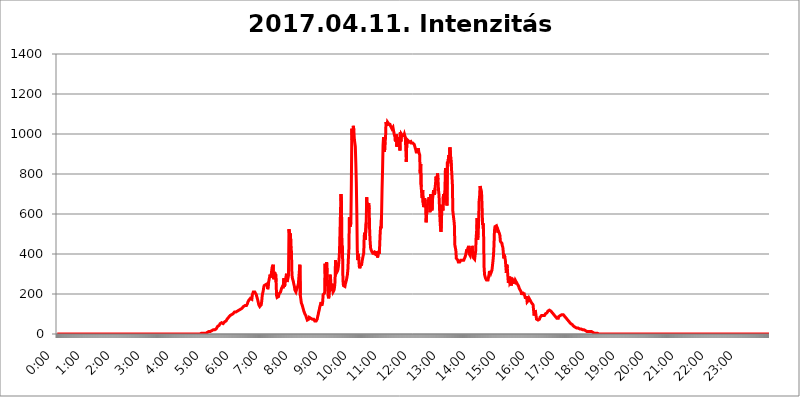
| Category | 2017.04.11. Intenzitás [W/m^2] |
|---|---|
| 0.0 | 0 |
| 0.0006944444444444445 | 0 |
| 0.001388888888888889 | 0 |
| 0.0020833333333333333 | 0 |
| 0.002777777777777778 | 0 |
| 0.003472222222222222 | 0 |
| 0.004166666666666667 | 0 |
| 0.004861111111111111 | 0 |
| 0.005555555555555556 | 0 |
| 0.0062499999999999995 | 0 |
| 0.006944444444444444 | 0 |
| 0.007638888888888889 | 0 |
| 0.008333333333333333 | 0 |
| 0.009027777777777779 | 0 |
| 0.009722222222222222 | 0 |
| 0.010416666666666666 | 0 |
| 0.011111111111111112 | 0 |
| 0.011805555555555555 | 0 |
| 0.012499999999999999 | 0 |
| 0.013194444444444444 | 0 |
| 0.013888888888888888 | 0 |
| 0.014583333333333332 | 0 |
| 0.015277777777777777 | 0 |
| 0.015972222222222224 | 0 |
| 0.016666666666666666 | 0 |
| 0.017361111111111112 | 0 |
| 0.018055555555555557 | 0 |
| 0.01875 | 0 |
| 0.019444444444444445 | 0 |
| 0.02013888888888889 | 0 |
| 0.020833333333333332 | 0 |
| 0.02152777777777778 | 0 |
| 0.022222222222222223 | 0 |
| 0.02291666666666667 | 0 |
| 0.02361111111111111 | 0 |
| 0.024305555555555556 | 0 |
| 0.024999999999999998 | 0 |
| 0.025694444444444447 | 0 |
| 0.02638888888888889 | 0 |
| 0.027083333333333334 | 0 |
| 0.027777777777777776 | 0 |
| 0.02847222222222222 | 0 |
| 0.029166666666666664 | 0 |
| 0.029861111111111113 | 0 |
| 0.030555555555555555 | 0 |
| 0.03125 | 0 |
| 0.03194444444444445 | 0 |
| 0.03263888888888889 | 0 |
| 0.03333333333333333 | 0 |
| 0.034027777777777775 | 0 |
| 0.034722222222222224 | 0 |
| 0.035416666666666666 | 0 |
| 0.036111111111111115 | 0 |
| 0.03680555555555556 | 0 |
| 0.0375 | 0 |
| 0.03819444444444444 | 0 |
| 0.03888888888888889 | 0 |
| 0.03958333333333333 | 0 |
| 0.04027777777777778 | 0 |
| 0.04097222222222222 | 0 |
| 0.041666666666666664 | 0 |
| 0.042361111111111106 | 0 |
| 0.04305555555555556 | 0 |
| 0.043750000000000004 | 0 |
| 0.044444444444444446 | 0 |
| 0.04513888888888889 | 0 |
| 0.04583333333333334 | 0 |
| 0.04652777777777778 | 0 |
| 0.04722222222222222 | 0 |
| 0.04791666666666666 | 0 |
| 0.04861111111111111 | 0 |
| 0.049305555555555554 | 0 |
| 0.049999999999999996 | 0 |
| 0.05069444444444445 | 0 |
| 0.051388888888888894 | 0 |
| 0.052083333333333336 | 0 |
| 0.05277777777777778 | 0 |
| 0.05347222222222222 | 0 |
| 0.05416666666666667 | 0 |
| 0.05486111111111111 | 0 |
| 0.05555555555555555 | 0 |
| 0.05625 | 0 |
| 0.05694444444444444 | 0 |
| 0.057638888888888885 | 0 |
| 0.05833333333333333 | 0 |
| 0.05902777777777778 | 0 |
| 0.059722222222222225 | 0 |
| 0.06041666666666667 | 0 |
| 0.061111111111111116 | 0 |
| 0.06180555555555556 | 0 |
| 0.0625 | 0 |
| 0.06319444444444444 | 0 |
| 0.06388888888888888 | 0 |
| 0.06458333333333334 | 0 |
| 0.06527777777777778 | 0 |
| 0.06597222222222222 | 0 |
| 0.06666666666666667 | 0 |
| 0.06736111111111111 | 0 |
| 0.06805555555555555 | 0 |
| 0.06874999999999999 | 0 |
| 0.06944444444444443 | 0 |
| 0.07013888888888889 | 0 |
| 0.07083333333333333 | 0 |
| 0.07152777777777779 | 0 |
| 0.07222222222222223 | 0 |
| 0.07291666666666667 | 0 |
| 0.07361111111111111 | 0 |
| 0.07430555555555556 | 0 |
| 0.075 | 0 |
| 0.07569444444444444 | 0 |
| 0.0763888888888889 | 0 |
| 0.07708333333333334 | 0 |
| 0.07777777777777778 | 0 |
| 0.07847222222222222 | 0 |
| 0.07916666666666666 | 0 |
| 0.0798611111111111 | 0 |
| 0.08055555555555556 | 0 |
| 0.08125 | 0 |
| 0.08194444444444444 | 0 |
| 0.08263888888888889 | 0 |
| 0.08333333333333333 | 0 |
| 0.08402777777777777 | 0 |
| 0.08472222222222221 | 0 |
| 0.08541666666666665 | 0 |
| 0.08611111111111112 | 0 |
| 0.08680555555555557 | 0 |
| 0.08750000000000001 | 0 |
| 0.08819444444444445 | 0 |
| 0.08888888888888889 | 0 |
| 0.08958333333333333 | 0 |
| 0.09027777777777778 | 0 |
| 0.09097222222222222 | 0 |
| 0.09166666666666667 | 0 |
| 0.09236111111111112 | 0 |
| 0.09305555555555556 | 0 |
| 0.09375 | 0 |
| 0.09444444444444444 | 0 |
| 0.09513888888888888 | 0 |
| 0.09583333333333333 | 0 |
| 0.09652777777777777 | 0 |
| 0.09722222222222222 | 0 |
| 0.09791666666666667 | 0 |
| 0.09861111111111111 | 0 |
| 0.09930555555555555 | 0 |
| 0.09999999999999999 | 0 |
| 0.10069444444444443 | 0 |
| 0.1013888888888889 | 0 |
| 0.10208333333333335 | 0 |
| 0.10277777777777779 | 0 |
| 0.10347222222222223 | 0 |
| 0.10416666666666667 | 0 |
| 0.10486111111111111 | 0 |
| 0.10555555555555556 | 0 |
| 0.10625 | 0 |
| 0.10694444444444444 | 0 |
| 0.1076388888888889 | 0 |
| 0.10833333333333334 | 0 |
| 0.10902777777777778 | 0 |
| 0.10972222222222222 | 0 |
| 0.1111111111111111 | 0 |
| 0.11180555555555556 | 0 |
| 0.11180555555555556 | 0 |
| 0.1125 | 0 |
| 0.11319444444444444 | 0 |
| 0.11388888888888889 | 0 |
| 0.11458333333333333 | 0 |
| 0.11527777777777777 | 0 |
| 0.11597222222222221 | 0 |
| 0.11666666666666665 | 0 |
| 0.1173611111111111 | 0 |
| 0.11805555555555557 | 0 |
| 0.11944444444444445 | 0 |
| 0.12013888888888889 | 0 |
| 0.12083333333333333 | 0 |
| 0.12152777777777778 | 0 |
| 0.12222222222222223 | 0 |
| 0.12291666666666667 | 0 |
| 0.12291666666666667 | 0 |
| 0.12361111111111112 | 0 |
| 0.12430555555555556 | 0 |
| 0.125 | 0 |
| 0.12569444444444444 | 0 |
| 0.12638888888888888 | 0 |
| 0.12708333333333333 | 0 |
| 0.16875 | 0 |
| 0.12847222222222224 | 0 |
| 0.12916666666666668 | 0 |
| 0.12986111111111112 | 0 |
| 0.13055555555555556 | 0 |
| 0.13125 | 0 |
| 0.13194444444444445 | 0 |
| 0.1326388888888889 | 0 |
| 0.13333333333333333 | 0 |
| 0.13402777777777777 | 0 |
| 0.13402777777777777 | 0 |
| 0.13472222222222222 | 0 |
| 0.13541666666666666 | 0 |
| 0.1361111111111111 | 0 |
| 0.13749999999999998 | 0 |
| 0.13819444444444443 | 0 |
| 0.1388888888888889 | 0 |
| 0.13958333333333334 | 0 |
| 0.14027777777777778 | 0 |
| 0.14097222222222222 | 0 |
| 0.14166666666666666 | 0 |
| 0.1423611111111111 | 0 |
| 0.14305555555555557 | 0 |
| 0.14375000000000002 | 0 |
| 0.14444444444444446 | 0 |
| 0.1451388888888889 | 0 |
| 0.1451388888888889 | 0 |
| 0.14652777777777778 | 0 |
| 0.14722222222222223 | 0 |
| 0.14791666666666667 | 0 |
| 0.1486111111111111 | 0 |
| 0.14930555555555555 | 0 |
| 0.15 | 0 |
| 0.15069444444444444 | 0 |
| 0.15138888888888888 | 0 |
| 0.15208333333333332 | 0 |
| 0.15277777777777776 | 0 |
| 0.15347222222222223 | 0 |
| 0.15416666666666667 | 0 |
| 0.15486111111111112 | 0 |
| 0.15555555555555556 | 0 |
| 0.15625 | 0 |
| 0.15694444444444444 | 0 |
| 0.15763888888888888 | 0 |
| 0.15833333333333333 | 0 |
| 0.15902777777777777 | 0 |
| 0.15972222222222224 | 0 |
| 0.16041666666666668 | 0 |
| 0.16111111111111112 | 0 |
| 0.16180555555555556 | 0 |
| 0.1625 | 0 |
| 0.16319444444444445 | 0 |
| 0.1638888888888889 | 0 |
| 0.16458333333333333 | 0 |
| 0.16527777777777777 | 0 |
| 0.16597222222222222 | 0 |
| 0.16666666666666666 | 0 |
| 0.1673611111111111 | 0 |
| 0.16805555555555554 | 0 |
| 0.16874999999999998 | 0 |
| 0.16944444444444443 | 0 |
| 0.17013888888888887 | 0 |
| 0.1708333333333333 | 0 |
| 0.17152777777777775 | 0 |
| 0.17222222222222225 | 0 |
| 0.1729166666666667 | 0 |
| 0.17361111111111113 | 0 |
| 0.17430555555555557 | 0 |
| 0.17500000000000002 | 0 |
| 0.17569444444444446 | 0 |
| 0.1763888888888889 | 0 |
| 0.17708333333333334 | 0 |
| 0.17777777777777778 | 0 |
| 0.17847222222222223 | 0 |
| 0.17916666666666667 | 0 |
| 0.1798611111111111 | 0 |
| 0.18055555555555555 | 0 |
| 0.18125 | 0 |
| 0.18194444444444444 | 0 |
| 0.1826388888888889 | 0 |
| 0.18333333333333335 | 0 |
| 0.1840277777777778 | 0 |
| 0.18472222222222223 | 0 |
| 0.18541666666666667 | 0 |
| 0.18611111111111112 | 0 |
| 0.18680555555555556 | 0 |
| 0.1875 | 0 |
| 0.18819444444444444 | 0 |
| 0.18888888888888888 | 0 |
| 0.18958333333333333 | 0 |
| 0.19027777777777777 | 0 |
| 0.1909722222222222 | 0 |
| 0.19166666666666665 | 0 |
| 0.19236111111111112 | 0 |
| 0.19305555555555554 | 0 |
| 0.19375 | 0 |
| 0.19444444444444445 | 0 |
| 0.1951388888888889 | 0 |
| 0.19583333333333333 | 0 |
| 0.19652777777777777 | 0 |
| 0.19722222222222222 | 0 |
| 0.19791666666666666 | 0 |
| 0.1986111111111111 | 0 |
| 0.19930555555555554 | 0 |
| 0.19999999999999998 | 0 |
| 0.20069444444444443 | 0 |
| 0.20138888888888887 | 0 |
| 0.2020833333333333 | 3.525 |
| 0.2027777777777778 | 0 |
| 0.2034722222222222 | 3.525 |
| 0.2041666666666667 | 3.525 |
| 0.20486111111111113 | 3.525 |
| 0.20555555555555557 | 3.525 |
| 0.20625000000000002 | 3.525 |
| 0.20694444444444446 | 3.525 |
| 0.2076388888888889 | 3.525 |
| 0.20833333333333334 | 3.525 |
| 0.20902777777777778 | 3.525 |
| 0.20972222222222223 | 7.887 |
| 0.21041666666666667 | 7.887 |
| 0.2111111111111111 | 7.887 |
| 0.21180555555555555 | 7.887 |
| 0.2125 | 12.257 |
| 0.21319444444444444 | 12.257 |
| 0.2138888888888889 | 12.257 |
| 0.21458333333333335 | 12.257 |
| 0.2152777777777778 | 12.257 |
| 0.21597222222222223 | 12.257 |
| 0.21666666666666667 | 16.636 |
| 0.21736111111111112 | 16.636 |
| 0.21805555555555556 | 16.636 |
| 0.21875 | 21.024 |
| 0.21944444444444444 | 21.024 |
| 0.22013888888888888 | 21.024 |
| 0.22083333333333333 | 21.024 |
| 0.22152777777777777 | 25.419 |
| 0.2222222222222222 | 25.419 |
| 0.22291666666666665 | 25.419 |
| 0.2236111111111111 | 29.823 |
| 0.22430555555555556 | 29.823 |
| 0.225 | 38.653 |
| 0.22569444444444445 | 43.079 |
| 0.2263888888888889 | 43.079 |
| 0.22708333333333333 | 43.079 |
| 0.22777777777777777 | 47.511 |
| 0.22847222222222222 | 51.951 |
| 0.22916666666666666 | 51.951 |
| 0.2298611111111111 | 56.398 |
| 0.23055555555555554 | 56.398 |
| 0.23124999999999998 | 60.85 |
| 0.23194444444444443 | 56.398 |
| 0.23263888888888887 | 51.951 |
| 0.2333333333333333 | 56.398 |
| 0.2340277777777778 | 56.398 |
| 0.2347222222222222 | 60.85 |
| 0.2354166666666667 | 60.85 |
| 0.23611111111111113 | 60.85 |
| 0.23680555555555557 | 65.31 |
| 0.23750000000000002 | 69.775 |
| 0.23819444444444446 | 74.246 |
| 0.2388888888888889 | 78.722 |
| 0.23958333333333334 | 78.722 |
| 0.24027777777777778 | 83.205 |
| 0.24097222222222223 | 87.692 |
| 0.24166666666666667 | 87.692 |
| 0.2423611111111111 | 92.184 |
| 0.24305555555555555 | 92.184 |
| 0.24375 | 96.682 |
| 0.24444444444444446 | 96.682 |
| 0.24513888888888888 | 101.184 |
| 0.24583333333333335 | 101.184 |
| 0.2465277777777778 | 101.184 |
| 0.24722222222222223 | 101.184 |
| 0.24791666666666667 | 105.69 |
| 0.24861111111111112 | 110.201 |
| 0.24930555555555556 | 110.201 |
| 0.25 | 114.716 |
| 0.25069444444444444 | 110.201 |
| 0.2513888888888889 | 114.716 |
| 0.2520833333333333 | 114.716 |
| 0.25277777777777777 | 114.716 |
| 0.2534722222222222 | 114.716 |
| 0.25416666666666665 | 119.235 |
| 0.2548611111111111 | 119.235 |
| 0.2555555555555556 | 123.758 |
| 0.25625000000000003 | 123.758 |
| 0.2569444444444445 | 123.758 |
| 0.2576388888888889 | 128.284 |
| 0.25833333333333336 | 128.284 |
| 0.2590277777777778 | 128.284 |
| 0.25972222222222224 | 132.814 |
| 0.2604166666666667 | 132.814 |
| 0.2611111111111111 | 137.347 |
| 0.26180555555555557 | 137.347 |
| 0.2625 | 137.347 |
| 0.26319444444444445 | 141.884 |
| 0.2638888888888889 | 146.423 |
| 0.26458333333333334 | 146.423 |
| 0.2652777777777778 | 141.884 |
| 0.2659722222222222 | 146.423 |
| 0.26666666666666666 | 150.964 |
| 0.2673611111111111 | 160.056 |
| 0.26805555555555555 | 164.605 |
| 0.26875 | 169.156 |
| 0.26944444444444443 | 169.156 |
| 0.2701388888888889 | 173.709 |
| 0.2708333333333333 | 178.264 |
| 0.27152777777777776 | 182.82 |
| 0.2722222222222222 | 182.82 |
| 0.27291666666666664 | 173.709 |
| 0.2736111111111111 | 196.497 |
| 0.2743055555555555 | 201.058 |
| 0.27499999999999997 | 210.182 |
| 0.27569444444444446 | 210.182 |
| 0.27638888888888885 | 210.182 |
| 0.27708333333333335 | 210.182 |
| 0.2777777777777778 | 205.62 |
| 0.27847222222222223 | 205.62 |
| 0.2791666666666667 | 196.497 |
| 0.2798611111111111 | 191.937 |
| 0.28055555555555556 | 191.937 |
| 0.28125 | 169.156 |
| 0.28194444444444444 | 164.605 |
| 0.2826388888888889 | 146.423 |
| 0.2833333333333333 | 141.884 |
| 0.28402777777777777 | 137.347 |
| 0.2847222222222222 | 137.347 |
| 0.28541666666666665 | 141.884 |
| 0.28611111111111115 | 146.423 |
| 0.28680555555555554 | 164.605 |
| 0.28750000000000003 | 191.937 |
| 0.2881944444444445 | 205.62 |
| 0.2888888888888889 | 214.746 |
| 0.28958333333333336 | 233 |
| 0.2902777777777778 | 242.127 |
| 0.29097222222222224 | 246.689 |
| 0.2916666666666667 | 246.689 |
| 0.2923611111111111 | 246.689 |
| 0.29305555555555557 | 251.251 |
| 0.29375 | 246.689 |
| 0.29444444444444445 | 251.251 |
| 0.2951388888888889 | 223.873 |
| 0.29583333333333334 | 223.873 |
| 0.2965277777777778 | 260.373 |
| 0.2972222222222222 | 274.047 |
| 0.29791666666666666 | 269.49 |
| 0.2986111111111111 | 296.808 |
| 0.29930555555555555 | 283.156 |
| 0.3 | 292.259 |
| 0.30069444444444443 | 314.98 |
| 0.3013888888888889 | 333.113 |
| 0.3020833333333333 | 337.639 |
| 0.30277777777777776 | 346.682 |
| 0.3034722222222222 | 274.047 |
| 0.30416666666666664 | 269.49 |
| 0.3048611111111111 | 310.44 |
| 0.3055555555555555 | 292.259 |
| 0.30624999999999997 | 301.354 |
| 0.3069444444444444 | 260.373 |
| 0.3076388888888889 | 191.937 |
| 0.30833333333333335 | 182.82 |
| 0.3090277777777778 | 182.82 |
| 0.30972222222222223 | 182.82 |
| 0.3104166666666667 | 187.378 |
| 0.3111111111111111 | 201.058 |
| 0.31180555555555556 | 201.058 |
| 0.3125 | 201.058 |
| 0.31319444444444444 | 210.182 |
| 0.3138888888888889 | 219.309 |
| 0.3145833333333333 | 228.436 |
| 0.31527777777777777 | 228.436 |
| 0.3159722222222222 | 237.564 |
| 0.31666666666666665 | 228.436 |
| 0.31736111111111115 | 233 |
| 0.31805555555555554 | 278.603 |
| 0.31875000000000003 | 237.564 |
| 0.3194444444444445 | 251.251 |
| 0.3201388888888889 | 269.49 |
| 0.32083333333333336 | 269.49 |
| 0.3215277777777778 | 301.354 |
| 0.32222222222222224 | 260.373 |
| 0.3229166666666667 | 269.49 |
| 0.3236111111111111 | 278.603 |
| 0.32430555555555557 | 292.259 |
| 0.325 | 523.88 |
| 0.32569444444444445 | 502.192 |
| 0.3263888888888889 | 475.972 |
| 0.32708333333333334 | 502.192 |
| 0.3277777777777778 | 427.39 |
| 0.3284722222222222 | 414.035 |
| 0.32916666666666666 | 296.808 |
| 0.3298611111111111 | 278.603 |
| 0.33055555555555555 | 269.49 |
| 0.33125 | 260.373 |
| 0.33194444444444443 | 246.689 |
| 0.3326388888888889 | 237.564 |
| 0.3333333333333333 | 219.309 |
| 0.3340277777777778 | 214.746 |
| 0.3347222222222222 | 210.182 |
| 0.3354166666666667 | 219.309 |
| 0.3361111111111111 | 223.873 |
| 0.3368055555555556 | 233 |
| 0.33749999999999997 | 242.127 |
| 0.33819444444444446 | 251.251 |
| 0.33888888888888885 | 251.251 |
| 0.33958333333333335 | 246.689 |
| 0.34027777777777773 | 346.682 |
| 0.34097222222222223 | 191.937 |
| 0.3416666666666666 | 173.709 |
| 0.3423611111111111 | 155.509 |
| 0.3430555555555555 | 150.964 |
| 0.34375 | 141.884 |
| 0.3444444444444445 | 137.347 |
| 0.3451388888888889 | 123.758 |
| 0.3458333333333334 | 114.716 |
| 0.34652777777777777 | 110.201 |
| 0.34722222222222227 | 101.184 |
| 0.34791666666666665 | 96.682 |
| 0.34861111111111115 | 92.184 |
| 0.34930555555555554 | 83.205 |
| 0.35000000000000003 | 78.722 |
| 0.3506944444444444 | 69.775 |
| 0.3513888888888889 | 69.775 |
| 0.3520833333333333 | 69.775 |
| 0.3527777777777778 | 74.246 |
| 0.3534722222222222 | 83.205 |
| 0.3541666666666667 | 83.205 |
| 0.3548611111111111 | 83.205 |
| 0.35555555555555557 | 78.722 |
| 0.35625 | 78.722 |
| 0.35694444444444445 | 78.722 |
| 0.3576388888888889 | 74.246 |
| 0.35833333333333334 | 74.246 |
| 0.3590277777777778 | 74.246 |
| 0.3597222222222222 | 74.246 |
| 0.36041666666666666 | 69.775 |
| 0.3611111111111111 | 65.31 |
| 0.36180555555555555 | 65.31 |
| 0.3625 | 60.85 |
| 0.36319444444444443 | 65.31 |
| 0.3638888888888889 | 69.775 |
| 0.3645833333333333 | 74.246 |
| 0.3652777777777778 | 87.692 |
| 0.3659722222222222 | 96.682 |
| 0.3666666666666667 | 110.201 |
| 0.3673611111111111 | 119.235 |
| 0.3680555555555556 | 132.814 |
| 0.36874999999999997 | 141.884 |
| 0.36944444444444446 | 146.423 |
| 0.37013888888888885 | 160.056 |
| 0.37083333333333335 | 141.884 |
| 0.37152777777777773 | 146.423 |
| 0.37222222222222223 | 160.056 |
| 0.3729166666666666 | 196.497 |
| 0.3736111111111111 | 191.937 |
| 0.3743055555555555 | 191.937 |
| 0.375 | 205.62 |
| 0.3756944444444445 | 351.198 |
| 0.3763888888888889 | 255.813 |
| 0.3770833333333334 | 274.047 |
| 0.37777777777777777 | 360.221 |
| 0.37847222222222227 | 305.898 |
| 0.37916666666666665 | 242.127 |
| 0.37986111111111115 | 191.937 |
| 0.38055555555555554 | 178.264 |
| 0.38125000000000003 | 191.937 |
| 0.3819444444444444 | 219.309 |
| 0.3826388888888889 | 296.808 |
| 0.3833333333333333 | 278.603 |
| 0.3840277777777778 | 237.564 |
| 0.3847222222222222 | 214.746 |
| 0.3854166666666667 | 251.251 |
| 0.3861111111111111 | 223.873 |
| 0.38680555555555557 | 210.182 |
| 0.3875 | 214.746 |
| 0.38819444444444445 | 219.309 |
| 0.3888888888888889 | 233 |
| 0.38958333333333334 | 260.373 |
| 0.3902777777777778 | 369.23 |
| 0.3909722222222222 | 314.98 |
| 0.39166666666666666 | 305.898 |
| 0.3923611111111111 | 301.354 |
| 0.39305555555555555 | 314.98 |
| 0.39375 | 324.052 |
| 0.39444444444444443 | 342.162 |
| 0.3951388888888889 | 369.23 |
| 0.3958333333333333 | 409.574 |
| 0.3965277777777778 | 409.574 |
| 0.3972222222222222 | 414.035 |
| 0.3979166666666667 | 699.717 |
| 0.3986111111111111 | 658.909 |
| 0.3993055555555556 | 449.551 |
| 0.39999999999999997 | 436.27 |
| 0.40069444444444446 | 269.49 |
| 0.40138888888888885 | 242.127 |
| 0.40208333333333335 | 242.127 |
| 0.40277777777777773 | 237.564 |
| 0.40347222222222223 | 237.564 |
| 0.4041666666666666 | 251.251 |
| 0.4048611111111111 | 260.373 |
| 0.4055555555555555 | 269.49 |
| 0.40625 | 283.156 |
| 0.4069444444444445 | 296.808 |
| 0.4076388888888889 | 324.052 |
| 0.4083333333333334 | 378.224 |
| 0.40902777777777777 | 422.943 |
| 0.40972222222222227 | 583.779 |
| 0.41041666666666665 | 545.416 |
| 0.41111111111111115 | 536.82 |
| 0.41180555555555554 | 558.261 |
| 0.41250000000000003 | 751.803 |
| 0.4131944444444444 | 1026.06 |
| 0.4138888888888889 | 970.034 |
| 0.4145833333333333 | 1007.383 |
| 0.4152777777777778 | 1041.019 |
| 0.4159722222222222 | 1018.587 |
| 0.4166666666666667 | 973.772 |
| 0.4173611111111111 | 970.034 |
| 0.41805555555555557 | 936.33 |
| 0.41875 | 856.855 |
| 0.41944444444444445 | 759.723 |
| 0.4201388888888889 | 613.252 |
| 0.42083333333333334 | 414.035 |
| 0.4215277777777778 | 369.23 |
| 0.4222222222222222 | 400.638 |
| 0.42291666666666666 | 378.224 |
| 0.4236111111111111 | 337.639 |
| 0.42430555555555555 | 328.584 |
| 0.425 | 333.113 |
| 0.42569444444444443 | 355.712 |
| 0.4263888888888889 | 342.162 |
| 0.4270833333333333 | 351.198 |
| 0.4277777777777778 | 369.23 |
| 0.4284722222222222 | 369.23 |
| 0.4291666666666667 | 364.728 |
| 0.4298611111111111 | 405.108 |
| 0.4305555555555556 | 489.108 |
| 0.43124999999999997 | 506.542 |
| 0.43194444444444446 | 471.582 |
| 0.43263888888888885 | 467.187 |
| 0.43333333333333335 | 558.261 |
| 0.43402777777777773 | 683.473 |
| 0.43472222222222223 | 613.252 |
| 0.4354166666666666 | 621.613 |
| 0.4361111111111111 | 621.613 |
| 0.4368055555555555 | 654.791 |
| 0.4375 | 625.784 |
| 0.4381944444444445 | 510.885 |
| 0.4388888888888889 | 458.38 |
| 0.4395833333333334 | 427.39 |
| 0.44027777777777777 | 422.943 |
| 0.44097222222222227 | 414.035 |
| 0.44166666666666665 | 409.574 |
| 0.44236111111111115 | 405.108 |
| 0.44305555555555554 | 409.574 |
| 0.44375000000000003 | 405.108 |
| 0.4444444444444444 | 409.574 |
| 0.4451388888888889 | 400.638 |
| 0.4458333333333333 | 396.164 |
| 0.4465277777777778 | 396.164 |
| 0.4472222222222222 | 396.164 |
| 0.4479166666666667 | 405.108 |
| 0.4486111111111111 | 414.035 |
| 0.44930555555555557 | 382.715 |
| 0.45 | 400.638 |
| 0.45069444444444445 | 414.035 |
| 0.4513888888888889 | 400.638 |
| 0.45208333333333334 | 431.833 |
| 0.4527777777777778 | 493.475 |
| 0.4534722222222222 | 536.82 |
| 0.45416666666666666 | 528.2 |
| 0.4548611111111111 | 596.45 |
| 0.45555555555555555 | 723.889 |
| 0.45625 | 818.392 |
| 0.45694444444444443 | 943.832 |
| 0.4576388888888889 | 984.98 |
| 0.4583333333333333 | 921.298 |
| 0.4590277777777778 | 909.996 |
| 0.4597222222222222 | 962.555 |
| 0.4604166666666667 | 977.508 |
| 0.4611111111111111 | 1059.756 |
| 0.4618055555555556 | 1059.756 |
| 0.46249999999999997 | 1041.019 |
| 0.46319444444444446 | 1059.756 |
| 0.46388888888888885 | 1056.004 |
| 0.46458333333333335 | 1052.255 |
| 0.46527777777777773 | 1052.255 |
| 0.46597222222222223 | 1052.255 |
| 0.4666666666666666 | 1048.508 |
| 0.4673611111111111 | 1041.019 |
| 0.4680555555555555 | 1044.762 |
| 0.46875 | 1037.277 |
| 0.4694444444444445 | 1026.06 |
| 0.4701388888888889 | 1022.323 |
| 0.4708333333333334 | 1033.537 |
| 0.47152777777777777 | 1037.277 |
| 0.47222222222222227 | 1033.537 |
| 0.47291666666666665 | 992.448 |
| 0.47361111111111115 | 999.916 |
| 0.47430555555555554 | 962.555 |
| 0.47500000000000003 | 970.034 |
| 0.4756944444444444 | 999.916 |
| 0.4763888888888889 | 936.33 |
| 0.4770833333333333 | 966.295 |
| 0.4777777777777778 | 970.034 |
| 0.4784722222222222 | 984.98 |
| 0.4791666666666667 | 988.714 |
| 0.4798611111111111 | 966.295 |
| 0.48055555555555557 | 917.534 |
| 0.48125 | 1007.383 |
| 0.48194444444444445 | 962.555 |
| 0.4826388888888889 | 999.916 |
| 0.48333333333333334 | 999.916 |
| 0.4840277777777778 | 992.448 |
| 0.4847222222222222 | 992.448 |
| 0.48541666666666666 | 988.714 |
| 0.4861111111111111 | 992.448 |
| 0.48680555555555555 | 999.916 |
| 0.4875 | 996.182 |
| 0.48819444444444443 | 981.244 |
| 0.4888888888888889 | 984.98 |
| 0.4895833333333333 | 860.676 |
| 0.4902777777777778 | 973.772 |
| 0.4909722222222222 | 977.508 |
| 0.4916666666666667 | 970.034 |
| 0.4923611111111111 | 966.295 |
| 0.4930555555555556 | 966.295 |
| 0.49374999999999997 | 958.814 |
| 0.49444444444444446 | 962.555 |
| 0.49513888888888885 | 962.555 |
| 0.49583333333333335 | 962.555 |
| 0.49652777777777773 | 955.071 |
| 0.49722222222222223 | 958.814 |
| 0.4979166666666666 | 955.071 |
| 0.4986111111111111 | 955.071 |
| 0.4993055555555555 | 955.071 |
| 0.5 | 955.071 |
| 0.5006944444444444 | 947.58 |
| 0.5013888888888889 | 947.58 |
| 0.5020833333333333 | 943.832 |
| 0.5027777777777778 | 921.298 |
| 0.5034722222222222 | 909.996 |
| 0.5041666666666667 | 913.766 |
| 0.5048611111111111 | 909.996 |
| 0.5055555555555555 | 909.996 |
| 0.50625 | 928.819 |
| 0.5069444444444444 | 913.766 |
| 0.5076388888888889 | 902.447 |
| 0.5083333333333333 | 894.885 |
| 0.5090277777777777 | 802.868 |
| 0.5097222222222222 | 849.199 |
| 0.5104166666666666 | 735.89 |
| 0.5111111111111112 | 703.762 |
| 0.5118055555555555 | 679.395 |
| 0.5125000000000001 | 719.877 |
| 0.5131944444444444 | 654.791 |
| 0.513888888888889 | 634.105 |
| 0.5145833333333333 | 646.537 |
| 0.5152777777777778 | 679.395 |
| 0.5159722222222222 | 663.019 |
| 0.5166666666666667 | 634.105 |
| 0.517361111111111 | 558.261 |
| 0.5180555555555556 | 562.53 |
| 0.5187499999999999 | 638.256 |
| 0.5194444444444445 | 650.667 |
| 0.5201388888888888 | 671.22 |
| 0.5208333333333334 | 663.019 |
| 0.5215277777777778 | 683.473 |
| 0.5222222222222223 | 646.537 |
| 0.5229166666666667 | 609.062 |
| 0.5236111111111111 | 699.717 |
| 0.5243055555555556 | 671.22 |
| 0.525 | 625.784 |
| 0.5256944444444445 | 617.436 |
| 0.5263888888888889 | 675.311 |
| 0.5270833333333333 | 695.666 |
| 0.5277777777777778 | 719.877 |
| 0.5284722222222222 | 723.889 |
| 0.5291666666666667 | 695.666 |
| 0.5298611111111111 | 727.896 |
| 0.5305555555555556 | 751.803 |
| 0.53125 | 787.258 |
| 0.5319444444444444 | 763.674 |
| 0.5326388888888889 | 775.492 |
| 0.5333333333333333 | 802.868 |
| 0.5340277777777778 | 771.559 |
| 0.5347222222222222 | 719.877 |
| 0.5354166666666667 | 695.666 |
| 0.5361111111111111 | 634.105 |
| 0.5368055555555555 | 571.049 |
| 0.5375 | 532.513 |
| 0.5381944444444444 | 510.885 |
| 0.5388888888888889 | 566.793 |
| 0.5395833333333333 | 646.537 |
| 0.5402777777777777 | 629.948 |
| 0.5409722222222222 | 617.436 |
| 0.5416666666666666 | 699.717 |
| 0.5423611111111112 | 658.909 |
| 0.5430555555555555 | 695.666 |
| 0.5437500000000001 | 719.877 |
| 0.5444444444444444 | 829.981 |
| 0.545138888888889 | 810.641 |
| 0.5458333333333333 | 715.858 |
| 0.5465277777777778 | 642.4 |
| 0.5472222222222222 | 860.676 |
| 0.5479166666666667 | 853.029 |
| 0.548611111111111 | 875.918 |
| 0.5493055555555556 | 894.885 |
| 0.5499999999999999 | 860.676 |
| 0.5506944444444445 | 932.576 |
| 0.5513888888888888 | 932.576 |
| 0.5520833333333334 | 936.33 |
| 0.5527777777777778 | 837.682 |
| 0.5534722222222223 | 841.526 |
| 0.5541666666666667 | 751.803 |
| 0.5548611111111111 | 613.252 |
| 0.5555555555555556 | 613.252 |
| 0.55625 | 613.252 |
| 0.5569444444444445 | 549.704 |
| 0.5576388888888889 | 445.129 |
| 0.5583333333333333 | 440.702 |
| 0.5590277777777778 | 418.492 |
| 0.5597222222222222 | 378.224 |
| 0.5604166666666667 | 373.729 |
| 0.5611111111111111 | 373.729 |
| 0.5618055555555556 | 369.23 |
| 0.5625 | 360.221 |
| 0.5631944444444444 | 360.221 |
| 0.5638888888888889 | 364.728 |
| 0.5645833333333333 | 360.221 |
| 0.5652777777777778 | 364.728 |
| 0.5659722222222222 | 369.23 |
| 0.5666666666666667 | 364.728 |
| 0.5673611111111111 | 373.729 |
| 0.5680555555555555 | 369.23 |
| 0.56875 | 369.23 |
| 0.5694444444444444 | 369.23 |
| 0.5701388888888889 | 369.23 |
| 0.5708333333333333 | 369.23 |
| 0.5715277777777777 | 373.729 |
| 0.5722222222222222 | 387.202 |
| 0.5729166666666666 | 396.164 |
| 0.5736111111111112 | 409.574 |
| 0.5743055555555555 | 422.943 |
| 0.5750000000000001 | 409.574 |
| 0.5756944444444444 | 414.035 |
| 0.576388888888889 | 431.833 |
| 0.5770833333333333 | 440.702 |
| 0.5777777777777778 | 400.638 |
| 0.5784722222222222 | 405.108 |
| 0.5791666666666667 | 391.685 |
| 0.579861111111111 | 405.108 |
| 0.5805555555555556 | 414.035 |
| 0.5812499999999999 | 422.943 |
| 0.5819444444444445 | 440.702 |
| 0.5826388888888888 | 400.638 |
| 0.5833333333333334 | 382.715 |
| 0.5840277777777778 | 382.715 |
| 0.5847222222222223 | 382.715 |
| 0.5854166666666667 | 373.729 |
| 0.5861111111111111 | 396.164 |
| 0.5868055555555556 | 414.035 |
| 0.5875 | 480.356 |
| 0.5881944444444445 | 515.223 |
| 0.5888888888888889 | 579.542 |
| 0.5895833333333333 | 471.582 |
| 0.5902777777777778 | 493.475 |
| 0.5909722222222222 | 558.261 |
| 0.5916666666666667 | 663.019 |
| 0.5923611111111111 | 687.544 |
| 0.5930555555555556 | 739.877 |
| 0.59375 | 735.89 |
| 0.5944444444444444 | 739.877 |
| 0.5951388888888889 | 703.762 |
| 0.5958333333333333 | 638.256 |
| 0.5965277777777778 | 545.416 |
| 0.5972222222222222 | 553.986 |
| 0.5979166666666667 | 510.885 |
| 0.5986111111111111 | 337.639 |
| 0.5993055555555555 | 296.808 |
| 0.6 | 287.709 |
| 0.6006944444444444 | 278.603 |
| 0.6013888888888889 | 274.047 |
| 0.6020833333333333 | 269.49 |
| 0.6027777777777777 | 269.49 |
| 0.6034722222222222 | 269.49 |
| 0.6041666666666666 | 269.49 |
| 0.6048611111111112 | 283.156 |
| 0.6055555555555555 | 296.808 |
| 0.6062500000000001 | 314.98 |
| 0.6069444444444444 | 301.354 |
| 0.607638888888889 | 314.98 |
| 0.6083333333333333 | 305.898 |
| 0.6090277777777778 | 310.44 |
| 0.6097222222222222 | 319.517 |
| 0.6104166666666667 | 314.98 |
| 0.611111111111111 | 364.728 |
| 0.6118055555555556 | 391.685 |
| 0.6124999999999999 | 440.702 |
| 0.6131944444444445 | 515.223 |
| 0.6138888888888888 | 536.82 |
| 0.6145833333333334 | 536.82 |
| 0.6152777777777778 | 532.513 |
| 0.6159722222222223 | 541.121 |
| 0.6166666666666667 | 532.513 |
| 0.6173611111111111 | 523.88 |
| 0.6180555555555556 | 506.542 |
| 0.61875 | 515.223 |
| 0.6194444444444445 | 510.885 |
| 0.6201388888888889 | 502.192 |
| 0.6208333333333333 | 493.475 |
| 0.6215277777777778 | 462.786 |
| 0.6222222222222222 | 467.187 |
| 0.6229166666666667 | 462.786 |
| 0.6236111111111111 | 453.968 |
| 0.6243055555555556 | 440.702 |
| 0.625 | 431.833 |
| 0.6256944444444444 | 405.108 |
| 0.6263888888888889 | 378.224 |
| 0.6270833333333333 | 396.164 |
| 0.6277777777777778 | 382.715 |
| 0.6284722222222222 | 369.23 |
| 0.6291666666666667 | 373.729 |
| 0.6298611111111111 | 305.898 |
| 0.6305555555555555 | 346.682 |
| 0.63125 | 328.584 |
| 0.6319444444444444 | 333.113 |
| 0.6326388888888889 | 255.813 |
| 0.6333333333333333 | 264.932 |
| 0.6340277777777777 | 287.709 |
| 0.6347222222222222 | 255.813 |
| 0.6354166666666666 | 260.373 |
| 0.6361111111111112 | 264.932 |
| 0.6368055555555555 | 242.127 |
| 0.6375000000000001 | 264.932 |
| 0.6381944444444444 | 274.047 |
| 0.638888888888889 | 251.251 |
| 0.6395833333333333 | 269.49 |
| 0.6402777777777778 | 269.49 |
| 0.6409722222222222 | 269.49 |
| 0.6416666666666667 | 260.373 |
| 0.642361111111111 | 269.49 |
| 0.6430555555555556 | 269.49 |
| 0.6437499999999999 | 264.932 |
| 0.6444444444444445 | 255.813 |
| 0.6451388888888888 | 251.251 |
| 0.6458333333333334 | 246.689 |
| 0.6465277777777778 | 242.127 |
| 0.6472222222222223 | 237.564 |
| 0.6479166666666667 | 228.436 |
| 0.6486111111111111 | 228.436 |
| 0.6493055555555556 | 219.309 |
| 0.65 | 214.746 |
| 0.6506944444444445 | 210.182 |
| 0.6513888888888889 | 196.497 |
| 0.6520833333333333 | 210.182 |
| 0.6527777777777778 | 201.058 |
| 0.6534722222222222 | 201.058 |
| 0.6541666666666667 | 196.497 |
| 0.6548611111111111 | 201.058 |
| 0.6555555555555556 | 196.497 |
| 0.65625 | 182.82 |
| 0.6569444444444444 | 182.82 |
| 0.6576388888888889 | 182.82 |
| 0.6583333333333333 | 182.82 |
| 0.6590277777777778 | 160.056 |
| 0.6597222222222222 | 164.605 |
| 0.6604166666666667 | 164.605 |
| 0.6611111111111111 | 169.156 |
| 0.6618055555555555 | 178.264 |
| 0.6625 | 178.264 |
| 0.6631944444444444 | 178.264 |
| 0.6638888888888889 | 164.605 |
| 0.6645833333333333 | 169.156 |
| 0.6652777777777777 | 155.509 |
| 0.6659722222222222 | 155.509 |
| 0.6666666666666666 | 155.509 |
| 0.6673611111111111 | 146.423 |
| 0.6680555555555556 | 119.235 |
| 0.6687500000000001 | 92.184 |
| 0.6694444444444444 | 101.184 |
| 0.6701388888888888 | 119.235 |
| 0.6708333333333334 | 110.201 |
| 0.6715277777777778 | 92.184 |
| 0.6722222222222222 | 74.246 |
| 0.6729166666666666 | 69.775 |
| 0.6736111111111112 | 69.775 |
| 0.6743055555555556 | 69.775 |
| 0.6749999999999999 | 69.775 |
| 0.6756944444444444 | 74.246 |
| 0.6763888888888889 | 74.246 |
| 0.6770833333333334 | 83.205 |
| 0.6777777777777777 | 83.205 |
| 0.6784722222222223 | 87.692 |
| 0.6791666666666667 | 92.184 |
| 0.6798611111111111 | 92.184 |
| 0.6805555555555555 | 92.184 |
| 0.68125 | 92.184 |
| 0.6819444444444445 | 92.184 |
| 0.6826388888888889 | 92.184 |
| 0.6833333333333332 | 92.184 |
| 0.6840277777777778 | 96.682 |
| 0.6847222222222222 | 101.184 |
| 0.6854166666666667 | 101.184 |
| 0.686111111111111 | 105.69 |
| 0.6868055555555556 | 105.69 |
| 0.6875 | 110.201 |
| 0.6881944444444444 | 114.716 |
| 0.688888888888889 | 114.716 |
| 0.6895833333333333 | 119.235 |
| 0.6902777777777778 | 119.235 |
| 0.6909722222222222 | 119.235 |
| 0.6916666666666668 | 114.716 |
| 0.6923611111111111 | 114.716 |
| 0.6930555555555555 | 110.201 |
| 0.69375 | 110.201 |
| 0.6944444444444445 | 105.69 |
| 0.6951388888888889 | 101.184 |
| 0.6958333333333333 | 101.184 |
| 0.6965277777777777 | 96.682 |
| 0.6972222222222223 | 92.184 |
| 0.6979166666666666 | 92.184 |
| 0.6986111111111111 | 87.692 |
| 0.6993055555555556 | 83.205 |
| 0.7000000000000001 | 83.205 |
| 0.7006944444444444 | 78.722 |
| 0.7013888888888888 | 78.722 |
| 0.7020833333333334 | 78.722 |
| 0.7027777777777778 | 78.722 |
| 0.7034722222222222 | 87.692 |
| 0.7041666666666666 | 83.205 |
| 0.7048611111111112 | 87.692 |
| 0.7055555555555556 | 92.184 |
| 0.7062499999999999 | 96.682 |
| 0.7069444444444444 | 96.682 |
| 0.7076388888888889 | 96.682 |
| 0.7083333333333334 | 96.682 |
| 0.7090277777777777 | 96.682 |
| 0.7097222222222223 | 96.682 |
| 0.7104166666666667 | 92.184 |
| 0.7111111111111111 | 92.184 |
| 0.7118055555555555 | 87.692 |
| 0.7125 | 83.205 |
| 0.7131944444444445 | 83.205 |
| 0.7138888888888889 | 78.722 |
| 0.7145833333333332 | 74.246 |
| 0.7152777777777778 | 74.246 |
| 0.7159722222222222 | 69.775 |
| 0.7166666666666667 | 65.31 |
| 0.717361111111111 | 65.31 |
| 0.7180555555555556 | 60.85 |
| 0.71875 | 56.398 |
| 0.7194444444444444 | 56.398 |
| 0.720138888888889 | 51.951 |
| 0.7208333333333333 | 51.951 |
| 0.7215277777777778 | 47.511 |
| 0.7222222222222222 | 47.511 |
| 0.7229166666666668 | 43.079 |
| 0.7236111111111111 | 43.079 |
| 0.7243055555555555 | 38.653 |
| 0.725 | 38.653 |
| 0.7256944444444445 | 38.653 |
| 0.7263888888888889 | 34.234 |
| 0.7270833333333333 | 34.234 |
| 0.7277777777777777 | 34.234 |
| 0.7284722222222223 | 29.823 |
| 0.7291666666666666 | 29.823 |
| 0.7298611111111111 | 29.823 |
| 0.7305555555555556 | 29.823 |
| 0.7312500000000001 | 25.419 |
| 0.7319444444444444 | 25.419 |
| 0.7326388888888888 | 25.419 |
| 0.7333333333333334 | 25.419 |
| 0.7340277777777778 | 25.419 |
| 0.7347222222222222 | 25.419 |
| 0.7354166666666666 | 21.024 |
| 0.7361111111111112 | 21.024 |
| 0.7368055555555556 | 21.024 |
| 0.7374999999999999 | 21.024 |
| 0.7381944444444444 | 21.024 |
| 0.7388888888888889 | 21.024 |
| 0.7395833333333334 | 21.024 |
| 0.7402777777777777 | 16.636 |
| 0.7409722222222223 | 16.636 |
| 0.7416666666666667 | 16.636 |
| 0.7423611111111111 | 16.636 |
| 0.7430555555555555 | 12.257 |
| 0.74375 | 12.257 |
| 0.7444444444444445 | 12.257 |
| 0.7451388888888889 | 12.257 |
| 0.7458333333333332 | 12.257 |
| 0.7465277777777778 | 12.257 |
| 0.7472222222222222 | 12.257 |
| 0.7479166666666667 | 12.257 |
| 0.748611111111111 | 12.257 |
| 0.7493055555555556 | 12.257 |
| 0.75 | 7.887 |
| 0.7506944444444444 | 7.887 |
| 0.751388888888889 | 7.887 |
| 0.7520833333333333 | 7.887 |
| 0.7527777777777778 | 7.887 |
| 0.7534722222222222 | 3.525 |
| 0.7541666666666668 | 3.525 |
| 0.7548611111111111 | 3.525 |
| 0.7555555555555555 | 3.525 |
| 0.75625 | 3.525 |
| 0.7569444444444445 | 3.525 |
| 0.7576388888888889 | 3.525 |
| 0.7583333333333333 | 3.525 |
| 0.7590277777777777 | 3.525 |
| 0.7597222222222223 | 0 |
| 0.7604166666666666 | 0 |
| 0.7611111111111111 | 0 |
| 0.7618055555555556 | 0 |
| 0.7625000000000001 | 0 |
| 0.7631944444444444 | 0 |
| 0.7638888888888888 | 0 |
| 0.7645833333333334 | 0 |
| 0.7652777777777778 | 0 |
| 0.7659722222222222 | 0 |
| 0.7666666666666666 | 0 |
| 0.7673611111111112 | 0 |
| 0.7680555555555556 | 0 |
| 0.7687499999999999 | 0 |
| 0.7694444444444444 | 0 |
| 0.7701388888888889 | 0 |
| 0.7708333333333334 | 0 |
| 0.7715277777777777 | 0 |
| 0.7722222222222223 | 0 |
| 0.7729166666666667 | 0 |
| 0.7736111111111111 | 0 |
| 0.7743055555555555 | 0 |
| 0.775 | 0 |
| 0.7756944444444445 | 0 |
| 0.7763888888888889 | 0 |
| 0.7770833333333332 | 0 |
| 0.7777777777777778 | 0 |
| 0.7784722222222222 | 0 |
| 0.7791666666666667 | 0 |
| 0.779861111111111 | 0 |
| 0.7805555555555556 | 0 |
| 0.78125 | 0 |
| 0.7819444444444444 | 0 |
| 0.782638888888889 | 0 |
| 0.7833333333333333 | 0 |
| 0.7840277777777778 | 0 |
| 0.7847222222222222 | 0 |
| 0.7854166666666668 | 0 |
| 0.7861111111111111 | 0 |
| 0.7868055555555555 | 0 |
| 0.7875 | 0 |
| 0.7881944444444445 | 0 |
| 0.7888888888888889 | 0 |
| 0.7895833333333333 | 0 |
| 0.7902777777777777 | 0 |
| 0.7909722222222223 | 0 |
| 0.7916666666666666 | 0 |
| 0.7923611111111111 | 0 |
| 0.7930555555555556 | 0 |
| 0.7937500000000001 | 0 |
| 0.7944444444444444 | 0 |
| 0.7951388888888888 | 0 |
| 0.7958333333333334 | 0 |
| 0.7965277777777778 | 0 |
| 0.7972222222222222 | 0 |
| 0.7979166666666666 | 0 |
| 0.7986111111111112 | 0 |
| 0.7993055555555556 | 0 |
| 0.7999999999999999 | 0 |
| 0.8006944444444444 | 0 |
| 0.8013888888888889 | 0 |
| 0.8020833333333334 | 0 |
| 0.8027777777777777 | 0 |
| 0.8034722222222223 | 0 |
| 0.8041666666666667 | 0 |
| 0.8048611111111111 | 0 |
| 0.8055555555555555 | 0 |
| 0.80625 | 0 |
| 0.8069444444444445 | 0 |
| 0.8076388888888889 | 0 |
| 0.8083333333333332 | 0 |
| 0.8090277777777778 | 0 |
| 0.8097222222222222 | 0 |
| 0.8104166666666667 | 0 |
| 0.811111111111111 | 0 |
| 0.8118055555555556 | 0 |
| 0.8125 | 0 |
| 0.8131944444444444 | 0 |
| 0.813888888888889 | 0 |
| 0.8145833333333333 | 0 |
| 0.8152777777777778 | 0 |
| 0.8159722222222222 | 0 |
| 0.8166666666666668 | 0 |
| 0.8173611111111111 | 0 |
| 0.8180555555555555 | 0 |
| 0.81875 | 0 |
| 0.8194444444444445 | 0 |
| 0.8201388888888889 | 0 |
| 0.8208333333333333 | 0 |
| 0.8215277777777777 | 0 |
| 0.8222222222222223 | 0 |
| 0.8229166666666666 | 0 |
| 0.8236111111111111 | 0 |
| 0.8243055555555556 | 0 |
| 0.8250000000000001 | 0 |
| 0.8256944444444444 | 0 |
| 0.8263888888888888 | 0 |
| 0.8270833333333334 | 0 |
| 0.8277777777777778 | 0 |
| 0.8284722222222222 | 0 |
| 0.8291666666666666 | 0 |
| 0.8298611111111112 | 0 |
| 0.8305555555555556 | 0 |
| 0.8312499999999999 | 0 |
| 0.8319444444444444 | 0 |
| 0.8326388888888889 | 0 |
| 0.8333333333333334 | 0 |
| 0.8340277777777777 | 0 |
| 0.8347222222222223 | 0 |
| 0.8354166666666667 | 0 |
| 0.8361111111111111 | 0 |
| 0.8368055555555555 | 0 |
| 0.8375 | 0 |
| 0.8381944444444445 | 0 |
| 0.8388888888888889 | 0 |
| 0.8395833333333332 | 0 |
| 0.8402777777777778 | 0 |
| 0.8409722222222222 | 0 |
| 0.8416666666666667 | 0 |
| 0.842361111111111 | 0 |
| 0.8430555555555556 | 0 |
| 0.84375 | 0 |
| 0.8444444444444444 | 0 |
| 0.845138888888889 | 0 |
| 0.8458333333333333 | 0 |
| 0.8465277777777778 | 0 |
| 0.8472222222222222 | 0 |
| 0.8479166666666668 | 0 |
| 0.8486111111111111 | 0 |
| 0.8493055555555555 | 0 |
| 0.85 | 0 |
| 0.8506944444444445 | 0 |
| 0.8513888888888889 | 0 |
| 0.8520833333333333 | 0 |
| 0.8527777777777777 | 0 |
| 0.8534722222222223 | 0 |
| 0.8541666666666666 | 0 |
| 0.8548611111111111 | 0 |
| 0.8555555555555556 | 0 |
| 0.8562500000000001 | 0 |
| 0.8569444444444444 | 0 |
| 0.8576388888888888 | 0 |
| 0.8583333333333334 | 0 |
| 0.8590277777777778 | 0 |
| 0.8597222222222222 | 0 |
| 0.8604166666666666 | 0 |
| 0.8611111111111112 | 0 |
| 0.8618055555555556 | 0 |
| 0.8624999999999999 | 0 |
| 0.8631944444444444 | 0 |
| 0.8638888888888889 | 0 |
| 0.8645833333333334 | 0 |
| 0.8652777777777777 | 0 |
| 0.8659722222222223 | 0 |
| 0.8666666666666667 | 0 |
| 0.8673611111111111 | 0 |
| 0.8680555555555555 | 0 |
| 0.86875 | 0 |
| 0.8694444444444445 | 0 |
| 0.8701388888888889 | 0 |
| 0.8708333333333332 | 0 |
| 0.8715277777777778 | 0 |
| 0.8722222222222222 | 0 |
| 0.8729166666666667 | 0 |
| 0.873611111111111 | 0 |
| 0.8743055555555556 | 0 |
| 0.875 | 0 |
| 0.8756944444444444 | 0 |
| 0.876388888888889 | 0 |
| 0.8770833333333333 | 0 |
| 0.8777777777777778 | 0 |
| 0.8784722222222222 | 0 |
| 0.8791666666666668 | 0 |
| 0.8798611111111111 | 0 |
| 0.8805555555555555 | 0 |
| 0.88125 | 0 |
| 0.8819444444444445 | 0 |
| 0.8826388888888889 | 0 |
| 0.8833333333333333 | 0 |
| 0.8840277777777777 | 0 |
| 0.8847222222222223 | 0 |
| 0.8854166666666666 | 0 |
| 0.8861111111111111 | 0 |
| 0.8868055555555556 | 0 |
| 0.8875000000000001 | 0 |
| 0.8881944444444444 | 0 |
| 0.8888888888888888 | 0 |
| 0.8895833333333334 | 0 |
| 0.8902777777777778 | 0 |
| 0.8909722222222222 | 0 |
| 0.8916666666666666 | 0 |
| 0.8923611111111112 | 0 |
| 0.8930555555555556 | 0 |
| 0.8937499999999999 | 0 |
| 0.8944444444444444 | 0 |
| 0.8951388888888889 | 0 |
| 0.8958333333333334 | 0 |
| 0.8965277777777777 | 0 |
| 0.8972222222222223 | 0 |
| 0.8979166666666667 | 0 |
| 0.8986111111111111 | 0 |
| 0.8993055555555555 | 0 |
| 0.9 | 0 |
| 0.9006944444444445 | 0 |
| 0.9013888888888889 | 0 |
| 0.9020833333333332 | 0 |
| 0.9027777777777778 | 0 |
| 0.9034722222222222 | 0 |
| 0.9041666666666667 | 0 |
| 0.904861111111111 | 0 |
| 0.9055555555555556 | 0 |
| 0.90625 | 0 |
| 0.9069444444444444 | 0 |
| 0.907638888888889 | 0 |
| 0.9083333333333333 | 0 |
| 0.9090277777777778 | 0 |
| 0.9097222222222222 | 0 |
| 0.9104166666666668 | 0 |
| 0.9111111111111111 | 0 |
| 0.9118055555555555 | 0 |
| 0.9125 | 0 |
| 0.9131944444444445 | 0 |
| 0.9138888888888889 | 0 |
| 0.9145833333333333 | 0 |
| 0.9152777777777777 | 0 |
| 0.9159722222222223 | 0 |
| 0.9166666666666666 | 0 |
| 0.9173611111111111 | 0 |
| 0.9180555555555556 | 0 |
| 0.9187500000000001 | 0 |
| 0.9194444444444444 | 0 |
| 0.9201388888888888 | 0 |
| 0.9208333333333334 | 0 |
| 0.9215277777777778 | 0 |
| 0.9222222222222222 | 0 |
| 0.9229166666666666 | 0 |
| 0.9236111111111112 | 0 |
| 0.9243055555555556 | 0 |
| 0.9249999999999999 | 0 |
| 0.9256944444444444 | 0 |
| 0.9263888888888889 | 0 |
| 0.9270833333333334 | 0 |
| 0.9277777777777777 | 0 |
| 0.9284722222222223 | 0 |
| 0.9291666666666667 | 0 |
| 0.9298611111111111 | 0 |
| 0.9305555555555555 | 0 |
| 0.93125 | 0 |
| 0.9319444444444445 | 0 |
| 0.9326388888888889 | 0 |
| 0.9333333333333332 | 0 |
| 0.9340277777777778 | 0 |
| 0.9347222222222222 | 0 |
| 0.9354166666666667 | 0 |
| 0.936111111111111 | 0 |
| 0.9368055555555556 | 0 |
| 0.9375 | 0 |
| 0.9381944444444444 | 0 |
| 0.938888888888889 | 0 |
| 0.9395833333333333 | 0 |
| 0.9402777777777778 | 0 |
| 0.9409722222222222 | 0 |
| 0.9416666666666668 | 0 |
| 0.9423611111111111 | 0 |
| 0.9430555555555555 | 0 |
| 0.94375 | 0 |
| 0.9444444444444445 | 0 |
| 0.9451388888888889 | 0 |
| 0.9458333333333333 | 0 |
| 0.9465277777777777 | 0 |
| 0.9472222222222223 | 0 |
| 0.9479166666666666 | 0 |
| 0.9486111111111111 | 0 |
| 0.9493055555555556 | 0 |
| 0.9500000000000001 | 0 |
| 0.9506944444444444 | 0 |
| 0.9513888888888888 | 0 |
| 0.9520833333333334 | 0 |
| 0.9527777777777778 | 0 |
| 0.9534722222222222 | 0 |
| 0.9541666666666666 | 0 |
| 0.9548611111111112 | 0 |
| 0.9555555555555556 | 0 |
| 0.9562499999999999 | 0 |
| 0.9569444444444444 | 0 |
| 0.9576388888888889 | 0 |
| 0.9583333333333334 | 0 |
| 0.9590277777777777 | 0 |
| 0.9597222222222223 | 0 |
| 0.9604166666666667 | 0 |
| 0.9611111111111111 | 0 |
| 0.9618055555555555 | 0 |
| 0.9625 | 0 |
| 0.9631944444444445 | 0 |
| 0.9638888888888889 | 0 |
| 0.9645833333333332 | 0 |
| 0.9652777777777778 | 0 |
| 0.9659722222222222 | 0 |
| 0.9666666666666667 | 0 |
| 0.967361111111111 | 0 |
| 0.9680555555555556 | 0 |
| 0.96875 | 0 |
| 0.9694444444444444 | 0 |
| 0.970138888888889 | 0 |
| 0.9708333333333333 | 0 |
| 0.9715277777777778 | 0 |
| 0.9722222222222222 | 0 |
| 0.9729166666666668 | 0 |
| 0.9736111111111111 | 0 |
| 0.9743055555555555 | 0 |
| 0.975 | 0 |
| 0.9756944444444445 | 0 |
| 0.9763888888888889 | 0 |
| 0.9770833333333333 | 0 |
| 0.9777777777777777 | 0 |
| 0.9784722222222223 | 0 |
| 0.9791666666666666 | 0 |
| 0.9798611111111111 | 0 |
| 0.9805555555555556 | 0 |
| 0.9812500000000001 | 0 |
| 0.9819444444444444 | 0 |
| 0.9826388888888888 | 0 |
| 0.9833333333333334 | 0 |
| 0.9840277777777778 | 0 |
| 0.9847222222222222 | 0 |
| 0.9854166666666666 | 0 |
| 0.9861111111111112 | 0 |
| 0.9868055555555556 | 0 |
| 0.9874999999999999 | 0 |
| 0.9881944444444444 | 0 |
| 0.9888888888888889 | 0 |
| 0.9895833333333334 | 0 |
| 0.9902777777777777 | 0 |
| 0.9909722222222223 | 0 |
| 0.9916666666666667 | 0 |
| 0.9923611111111111 | 0 |
| 0.9930555555555555 | 0 |
| 0.99375 | 0 |
| 0.9944444444444445 | 0 |
| 0.9951388888888889 | 0 |
| 0.9958333333333332 | 0 |
| 0.9965277777777778 | 0 |
| 0.9972222222222222 | 0 |
| 0.9979166666666667 | 0 |
| 0.998611111111111 | 0 |
| 0.9993055555555556 | 0 |